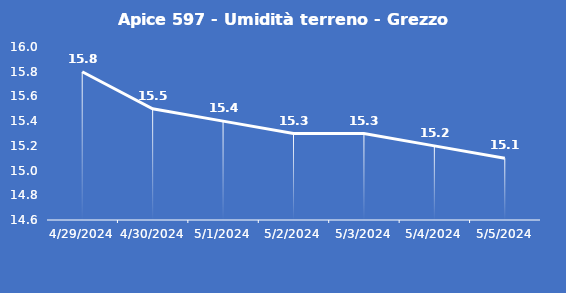
| Category | Apice 597 - Umidità terreno - Grezzo (%VWC) |
|---|---|
| 4/29/24 | 15.8 |
| 4/30/24 | 15.5 |
| 5/1/24 | 15.4 |
| 5/2/24 | 15.3 |
| 5/3/24 | 15.3 |
| 5/4/24 | 15.2 |
| 5/5/24 | 15.1 |